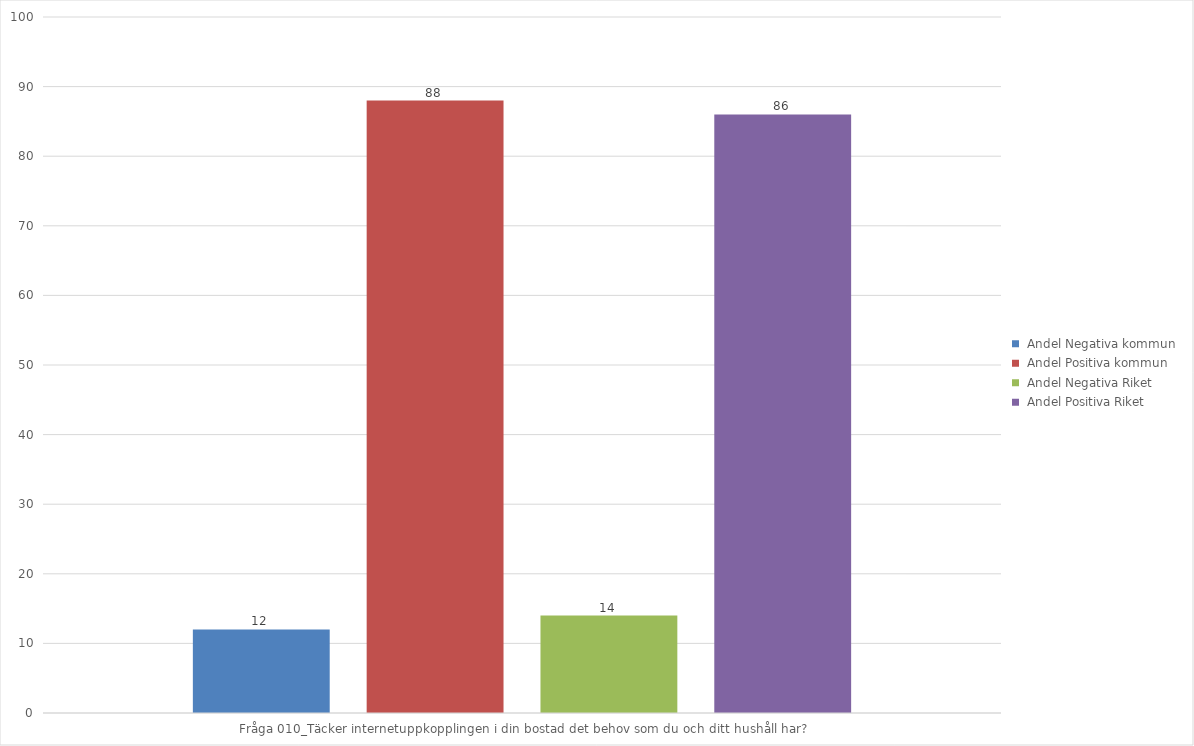
| Category |  Andel Negativa kommun |  Andel Positiva kommun |  Andel Negativa Riket |  Andel Positiva Riket |
|---|---|---|---|---|
| Fråga 010_Täcker internetuppkopplingen i din bostad det behov som du och ditt hushåll har? | 12 | 88 | 14 | 86 |